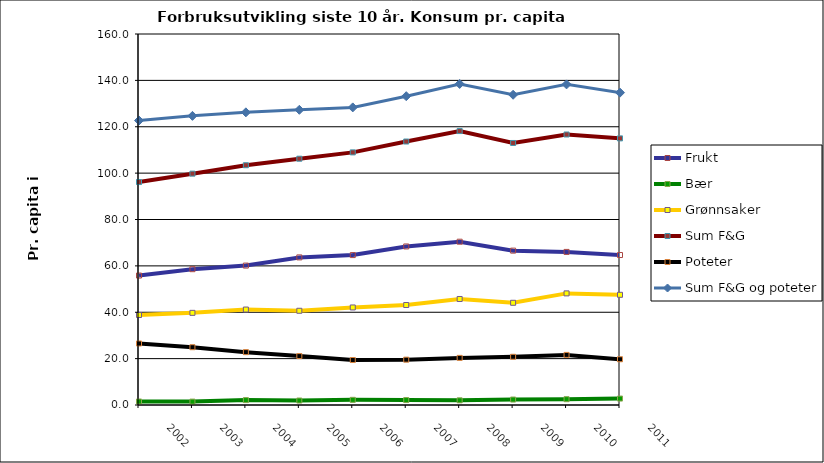
| Category | Frukt | Bær | Grønnsaker | Sum F&G | Poteter | Sum F&G og poteter |
|---|---|---|---|---|---|---|
| 2002.0 | 55.833 | 1.507 | 38.813 | 96.153 | 26.528 | 122.681 |
| 2003.0 | 58.575 | 1.456 | 39.74 | 99.772 | 24.921 | 124.693 |
| 2004.0 | 60.126 | 2.112 | 41.169 | 103.407 | 22.8 | 126.206 |
| 2005.0 | 63.653 | 1.926 | 40.636 | 106.215 | 21.096 | 127.311 |
| 2006.0 | 64.653 | 2.228 | 42.065 | 108.946 | 19.4 | 128.346 |
| 2007.0 | 68.375 | 2.13 | 43.125 | 113.63 | 19.549 | 133.179 |
| 2008.0 | 70.419 | 2.008 | 45.716 | 118.143 | 20.321 | 138.464 |
| 2009.0 | 66.574 | 2.353 | 44.078 | 113.005 | 20.795 | 133.8 |
| 2010.0 | 66.023 | 2.507 | 48.134 | 116.664 | 21.609 | 138.273 |
| 2011.0 | 64.681 | 2.779 | 47.525 | 114.985 | 19.724 | 134.709 |